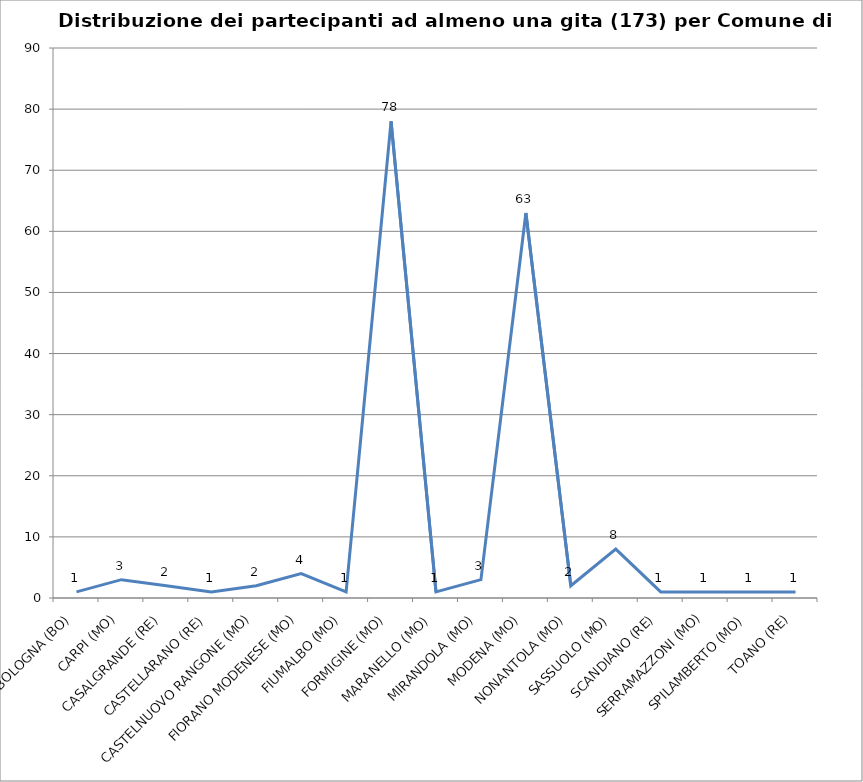
| Category | Nr. Tesserati |
|---|---|
| BOLOGNA (BO) | 1 |
| CARPI (MO) | 3 |
| CASALGRANDE (RE) | 2 |
| CASTELLARANO (RE) | 1 |
| CASTELNUOVO RANGONE (MO) | 2 |
| FIORANO MODENESE (MO) | 4 |
| FIUMALBO (MO) | 1 |
| FORMIGINE (MO) | 78 |
| MARANELLO (MO) | 1 |
| MIRANDOLA (MO) | 3 |
| MODENA (MO) | 63 |
| NONANTOLA (MO) | 2 |
| SASSUOLO (MO) | 8 |
| SCANDIANO (RE) | 1 |
| SERRAMAZZONI (MO) | 1 |
| SPILAMBERTO (MO) | 1 |
| TOANO (RE) | 1 |